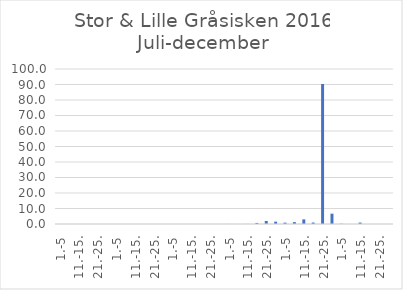
| Category | Series 0 |
|---|---|
| 1.-5 | 0 |
| 6.-10. | 0 |
| 11.-15. | 0 |
| 16.-20. | 0 |
| 21.-25. | 0 |
| 26.-31. | 0 |
| 1.-5 | 0 |
| 6.-10. | 0 |
| 11.-15. | 0 |
| 16.-20. | 0 |
| 21.-25. | 0 |
| 26.-31. | 0 |
| 1.-5 | 0 |
| 6.-10. | 0 |
| 11.-15. | 0 |
| 16.-20. | 0 |
| 21.-25. | 0 |
| 26.-30. | 0 |
| 1.-5 | 0.035 |
| 6.-10. | 0 |
| 11.-15. | 0.047 |
| 16.-20. | 0.699 |
| 21.-25. | 1.918 |
| 26.-31. | 1.511 |
| 1.-5 | 0.869 |
| 6.-10. | 1.211 |
| 11.-15. | 2.982 |
| 16.-20. | 0.943 |
| 21.-25. | 90.328 |
| 26.-30. | 6.674 |
| 1.-5 | 0.159 |
| 6.-10. | 0 |
| 11.-15. | 0.908 |
| 16.-20. | 0 |
| 21.-25. | 0 |
| 26.-31. | 0 |